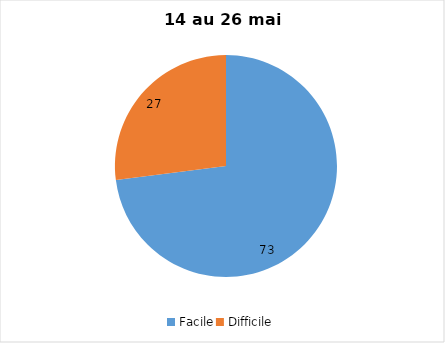
| Category | Series 0 |
|---|---|
| Facile | 73 |
| Difficile | 27 |